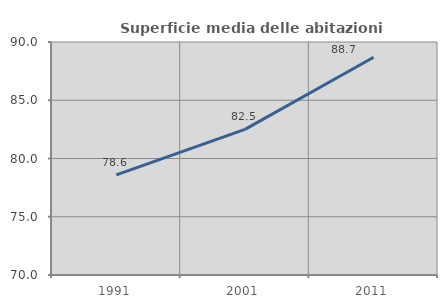
| Category | Superficie media delle abitazioni occupate |
|---|---|
| 1991.0 | 78.592 |
| 2001.0 | 82.503 |
| 2011.0 | 88.688 |